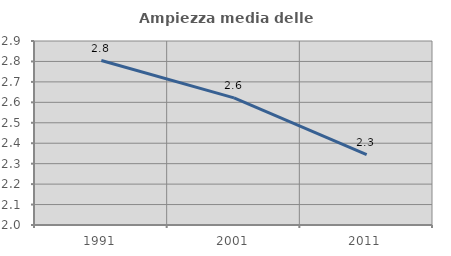
| Category | Ampiezza media delle famiglie |
|---|---|
| 1991.0 | 2.804 |
| 2001.0 | 2.622 |
| 2011.0 | 2.344 |